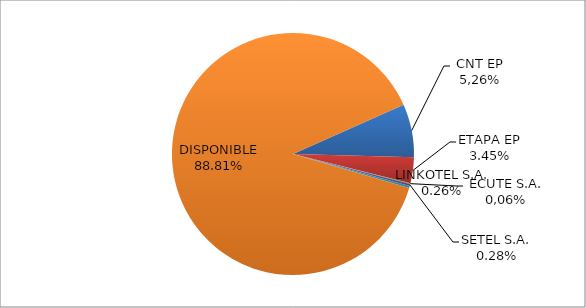
| Category | CODIGO DE AREA 7 |
|---|---|
| CORPORACIÓN NACIONAL TELECOMUNICACIONES CNT EP | 0.071 |
| ETAPA EP | 0.035 |
| CONECEL (ex ECUADORTELECOM S.A.) | 0.001 |
| SETEL S.A. | 0.003 |
| LINKOTEL S.A. | 0.003 |
| DISPONIBLE | 0.888 |